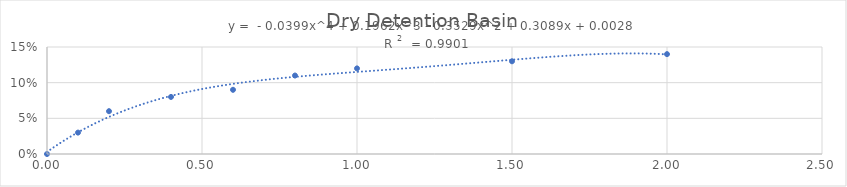
| Category | Series 0 |
|---|---|
| 0.0 | 0 |
| 0.1 | 0.03 |
| 0.2 | 0.06 |
| 0.4 | 0.08 |
| 0.6 | 0.09 |
| 0.8 | 0.11 |
| 1.0 | 0.12 |
| 1.5 | 0.13 |
| 2.0 | 0.14 |